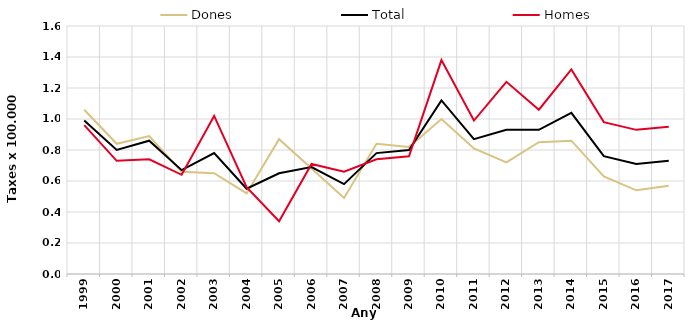
| Category | Dones | Total | Homes |
|---|---|---|---|
| 1999.0 | 1.06 | 0.99 | 0.96 |
| 2000.0 | 0.84 | 0.8 | 0.73 |
| 2001.0 | 0.89 | 0.86 | 0.74 |
| 2002.0 | 0.66 | 0.67 | 0.64 |
| 2003.0 | 0.65 | 0.78 | 1.02 |
| 2004.0 | 0.52 | 0.55 | 0.56 |
| 2005.0 | 0.87 | 0.65 | 0.34 |
| 2006.0 | 0.68 | 0.69 | 0.71 |
| 2007.0 | 0.49 | 0.58 | 0.66 |
| 2008.0 | 0.84 | 0.78 | 0.74 |
| 2009.0 | 0.82 | 0.8 | 0.76 |
| 2010.0 | 1 | 1.12 | 1.38 |
| 2011.0 | 0.81 | 0.87 | 0.99 |
| 2012.0 | 0.72 | 0.93 | 1.24 |
| 2013.0 | 0.85 | 0.93 | 1.06 |
| 2014.0 | 0.86 | 1.04 | 1.32 |
| 2015.0 | 0.63 | 0.76 | 0.98 |
| 2016.0 | 0.54 | 0.71 | 0.93 |
| 2017.0 | 0.57 | 0.73 | 0.95 |